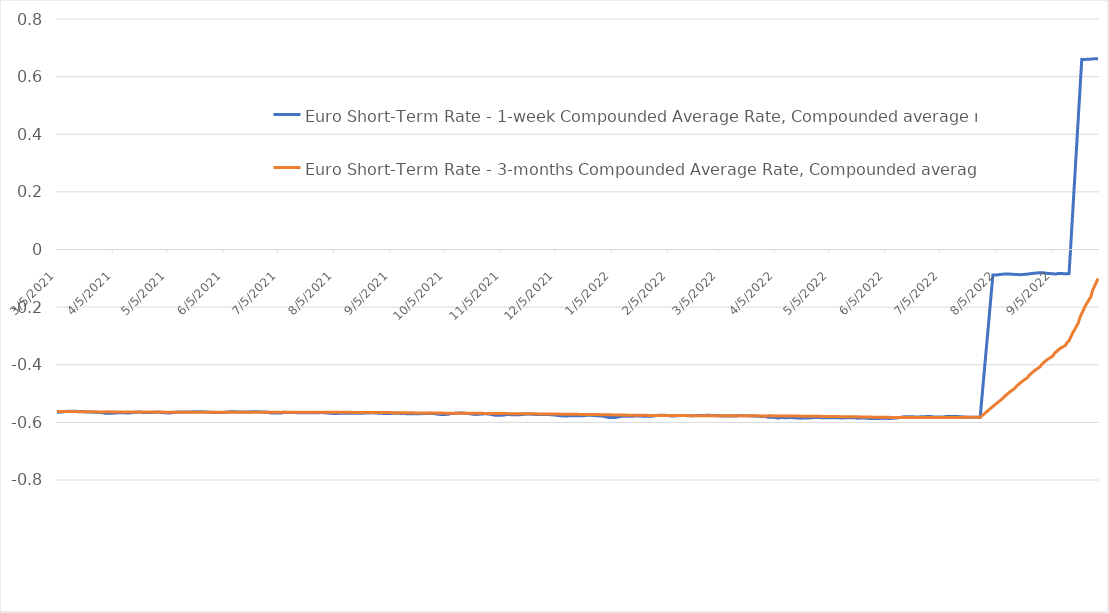
| Category | Euro Short-Term Rate - 1-week Compounded Average Rate, Compounded average rate | Euro Short-Term Rate - 3-months Compounded Average Rate, Compounded average rate |
|---|---|---|
| 9/30/22 | 0.662 | -0.101 |
| 9/29/22 | 0.662 | -0.114 |
| 9/28/22 | 0.662 | -0.128 |
| 9/27/22 | 0.661 | -0.141 |
| 9/26/22 | 0.661 | -0.164 |
| 9/23/22 | 0.66 | -0.195 |
| 9/22/22 | 0.66 | -0.209 |
| 9/21/22 | 0.66 | -0.222 |
| 9/20/22 | 0.554 | -0.236 |
| 9/19/22 | 0.448 | -0.256 |
| 9/16/22 | 0.128 | -0.29 |
| 9/15/22 | 0.022 | -0.303 |
| 9/14/22 | -0.084 | -0.317 |
| 9/13/22 | -0.084 | -0.322 |
| 9/12/22 | -0.084 | -0.333 |
| 9/9/22 | -0.083 | -0.344 |
| 9/8/22 | -0.083 | -0.349 |
| 9/7/22 | -0.085 | -0.354 |
| 9/6/22 | -0.085 | -0.36 |
| 9/5/22 | -0.084 | -0.37 |
| 9/2/22 | -0.083 | -0.382 |
| 9/1/22 | -0.082 | -0.387 |
| 8/31/22 | -0.081 | -0.393 |
| 8/30/22 | -0.08 | -0.398 |
| 8/29/22 | -0.081 | -0.407 |
| 8/26/22 | -0.082 | -0.42 |
| 8/25/22 | -0.083 | -0.426 |
| 8/24/22 | -0.084 | -0.431 |
| 8/23/22 | -0.085 | -0.436 |
| 8/22/22 | -0.085 | -0.445 |
| 8/19/22 | -0.087 | -0.458 |
| 8/18/22 | -0.087 | -0.464 |
| 8/17/22 | -0.087 | -0.469 |
| 8/16/22 | -0.087 | -0.475 |
| 8/15/22 | -0.086 | -0.482 |
| 8/12/22 | -0.085 | -0.496 |
| 8/11/22 | -0.085 | -0.501 |
| 8/10/22 | -0.085 | -0.507 |
| 8/9/22 | -0.085 | -0.512 |
| 8/8/22 | -0.086 | -0.519 |
| 8/5/22 | -0.088 | -0.534 |
| 8/4/22 | -0.089 | -0.539 |
| 8/3/22 | -0.089 | -0.545 |
| 8/2/22 | -0.159 | -0.55 |
| 8/1/22 | -0.23 | -0.555 |
| 7/29/22 | -0.44 | -0.572 |
| 7/28/22 | -0.511 | -0.577 |
| 7/27/22 | -0.582 | -0.582 |
| 7/26/22 | -0.583 | -0.582 |
| 7/25/22 | -0.582 | -0.583 |
| 7/22/22 | -0.582 | -0.583 |
| 7/21/22 | -0.582 | -0.583 |
| 7/20/22 | -0.582 | -0.583 |
| 7/19/22 | -0.582 | -0.583 |
| 7/18/22 | -0.581 | -0.583 |
| 7/15/22 | -0.58 | -0.583 |
| 7/14/22 | -0.58 | -0.583 |
| 7/13/22 | -0.579 | -0.583 |
| 7/12/22 | -0.579 | -0.583 |
| 7/11/22 | -0.579 | -0.583 |
| 7/8/22 | -0.58 | -0.583 |
| 7/7/22 | -0.582 | -0.583 |
| 7/6/22 | -0.581 | -0.583 |
| 7/5/22 | -0.581 | -0.583 |
| 7/4/22 | -0.581 | -0.583 |
| 7/1/22 | -0.581 | -0.583 |
| 6/30/22 | -0.579 | -0.583 |
| 6/29/22 | -0.58 | -0.583 |
| 6/28/22 | -0.58 | -0.583 |
| 6/27/22 | -0.58 | -0.583 |
| 6/24/22 | -0.581 | -0.583 |
| 6/23/22 | -0.581 | -0.583 |
| 6/22/22 | -0.582 | -0.583 |
| 6/21/22 | -0.581 | -0.583 |
| 6/20/22 | -0.581 | -0.583 |
| 6/17/22 | -0.58 | -0.583 |
| 6/16/22 | -0.58 | -0.583 |
| 6/15/22 | -0.581 | -0.583 |
| 6/14/22 | -0.581 | -0.583 |
| 6/13/22 | -0.583 | -0.583 |
| 6/10/22 | -0.585 | -0.583 |
| 6/9/22 | -0.586 | -0.583 |
| 6/8/22 | -0.586 | -0.583 |
| 6/7/22 | -0.587 | -0.583 |
| 6/6/22 | -0.586 | -0.582 |
| 6/3/22 | -0.585 | -0.582 |
| 6/2/22 | -0.586 | -0.582 |
| 6/1/22 | -0.587 | -0.582 |
| 5/31/22 | -0.586 | -0.582 |
| 5/30/22 | -0.586 | -0.582 |
| 5/27/22 | -0.586 | -0.582 |
| 5/26/22 | -0.586 | -0.582 |
| 5/25/22 | -0.585 | -0.581 |
| 5/24/22 | -0.585 | -0.581 |
| 5/23/22 | -0.585 | -0.581 |
| 5/20/22 | -0.585 | -0.581 |
| 5/19/22 | -0.584 | -0.581 |
| 5/18/22 | -0.584 | -0.581 |
| 5/17/22 | -0.584 | -0.581 |
| 5/16/22 | -0.584 | -0.581 |
| 5/13/22 | -0.584 | -0.58 |
| 5/12/22 | -0.585 | -0.58 |
| 5/11/22 | -0.585 | -0.58 |
| 5/10/22 | -0.584 | -0.58 |
| 5/9/22 | -0.584 | -0.58 |
| 5/6/22 | -0.584 | -0.58 |
| 5/5/22 | -0.584 | -0.58 |
| 5/4/22 | -0.584 | -0.58 |
| 5/3/22 | -0.584 | -0.579 |
| 5/2/22 | -0.584 | -0.579 |
| 4/29/22 | -0.583 | -0.579 |
| 4/28/22 | -0.583 | -0.579 |
| 4/27/22 | -0.583 | -0.579 |
| 4/26/22 | -0.583 | -0.579 |
| 4/25/22 | -0.584 | -0.579 |
| 4/22/22 | -0.585 | -0.579 |
| 4/21/22 | -0.585 | -0.578 |
| 4/20/22 | -0.585 | -0.578 |
| 4/19/22 | -0.585 | -0.578 |
| 4/14/22 | -0.583 | -0.578 |
| 4/13/22 | -0.583 | -0.578 |
| 4/12/22 | -0.584 | -0.578 |
| 4/11/22 | -0.584 | -0.578 |
| 4/8/22 | -0.583 | -0.578 |
| 4/7/22 | -0.585 | -0.578 |
| 4/6/22 | -0.584 | -0.578 |
| 4/5/22 | -0.583 | -0.577 |
| 4/4/22 | -0.582 | -0.577 |
| 4/1/22 | -0.582 | -0.577 |
| 3/31/22 | -0.58 | -0.578 |
| 3/30/22 | -0.58 | -0.578 |
| 3/29/22 | -0.58 | -0.578 |
| 3/28/22 | -0.579 | -0.577 |
| 3/25/22 | -0.578 | -0.577 |
| 3/24/22 | -0.578 | -0.577 |
| 3/23/22 | -0.578 | -0.577 |
| 3/22/22 | -0.577 | -0.577 |
| 3/21/22 | -0.577 | -0.577 |
| 3/18/22 | -0.577 | -0.577 |
| 3/17/22 | -0.576 | -0.577 |
| 3/16/22 | -0.577 | -0.577 |
| 3/15/22 | -0.578 | -0.577 |
| 3/14/22 | -0.578 | -0.577 |
| 3/11/22 | -0.578 | -0.577 |
| 3/10/22 | -0.578 | -0.577 |
| 3/9/22 | -0.578 | -0.577 |
| 3/8/22 | -0.578 | -0.577 |
| 3/7/22 | -0.578 | -0.577 |
| 3/4/22 | -0.577 | -0.577 |
| 3/3/22 | -0.577 | -0.577 |
| 3/2/22 | -0.576 | -0.577 |
| 3/1/22 | -0.576 | -0.577 |
| 2/28/22 | -0.575 | -0.577 |
| 2/25/22 | -0.576 | -0.577 |
| 2/24/22 | -0.576 | -0.577 |
| 2/23/22 | -0.576 | -0.577 |
| 2/22/22 | -0.576 | -0.577 |
| 2/21/22 | -0.576 | -0.577 |
| 2/18/22 | -0.577 | -0.577 |
| 2/17/22 | -0.577 | -0.577 |
| 2/16/22 | -0.577 | -0.577 |
| 2/15/22 | -0.577 | -0.576 |
| 2/14/22 | -0.577 | -0.576 |
| 2/11/22 | -0.577 | -0.576 |
| 2/10/22 | -0.577 | -0.576 |
| 2/9/22 | -0.577 | -0.576 |
| 2/8/22 | -0.578 | -0.576 |
| 2/7/22 | -0.578 | -0.576 |
| 2/4/22 | -0.576 | -0.576 |
| 2/3/22 | -0.575 | -0.576 |
| 2/2/22 | -0.575 | -0.576 |
| 2/1/22 | -0.575 | -0.576 |
| 1/31/22 | -0.575 | -0.576 |
| 1/28/22 | -0.578 | -0.576 |
| 1/27/22 | -0.578 | -0.576 |
| 1/26/22 | -0.579 | -0.576 |
| 1/25/22 | -0.579 | -0.576 |
| 1/24/22 | -0.579 | -0.576 |
| 1/21/22 | -0.578 | -0.575 |
| 1/20/22 | -0.578 | -0.575 |
| 1/19/22 | -0.578 | -0.575 |
| 1/18/22 | -0.578 | -0.575 |
| 1/17/22 | -0.578 | -0.575 |
| 1/14/22 | -0.579 | -0.575 |
| 1/13/22 | -0.579 | -0.575 |
| 1/12/22 | -0.579 | -0.575 |
| 1/11/22 | -0.579 | -0.575 |
| 1/10/22 | -0.579 | -0.574 |
| 1/7/22 | -0.583 | -0.574 |
| 1/6/22 | -0.583 | -0.574 |
| 1/5/22 | -0.583 | -0.574 |
| 1/4/22 | -0.583 | -0.574 |
| 1/3/22 | -0.583 | -0.574 |
| 12/31/21 | -0.578 | -0.573 |
| 12/30/21 | -0.578 | -0.573 |
| 12/29/21 | -0.577 | -0.573 |
| 12/28/21 | -0.577 | -0.573 |
| 12/27/21 | -0.577 | -0.573 |
| 12/24/21 | -0.575 | -0.573 |
| 12/23/21 | -0.575 | -0.573 |
| 12/22/21 | -0.576 | -0.572 |
| 12/21/21 | -0.576 | -0.572 |
| 12/20/21 | -0.577 | -0.572 |
| 12/17/21 | -0.577 | -0.572 |
| 12/16/21 | -0.577 | -0.572 |
| 12/15/21 | -0.577 | -0.572 |
| 12/14/21 | -0.577 | -0.572 |
| 12/13/21 | -0.577 | -0.572 |
| 12/10/21 | -0.578 | -0.572 |
| 12/9/21 | -0.577 | -0.572 |
| 12/8/21 | -0.577 | -0.571 |
| 12/7/21 | -0.577 | -0.571 |
| 12/6/21 | -0.576 | -0.571 |
| 12/3/21 | -0.574 | -0.571 |
| 12/2/21 | -0.573 | -0.571 |
| 12/1/21 | -0.573 | -0.571 |
| 11/30/21 | -0.573 | -0.571 |
| 11/29/21 | -0.573 | -0.571 |
| 11/26/21 | -0.573 | -0.571 |
| 11/25/21 | -0.572 | -0.57 |
| 11/24/21 | -0.573 | -0.57 |
| 11/23/21 | -0.572 | -0.57 |
| 11/22/21 | -0.572 | -0.57 |
| 11/19/21 | -0.571 | -0.57 |
| 11/18/21 | -0.572 | -0.57 |
| 11/17/21 | -0.572 | -0.57 |
| 11/16/21 | -0.573 | -0.57 |
| 11/15/21 | -0.574 | -0.57 |
| 11/12/21 | -0.574 | -0.57 |
| 11/11/21 | -0.574 | -0.57 |
| 11/10/21 | -0.573 | -0.57 |
| 11/9/21 | -0.572 | -0.57 |
| 11/8/21 | -0.573 | -0.57 |
| 11/5/21 | -0.576 | -0.569 |
| 11/4/21 | -0.576 | -0.569 |
| 11/3/21 | -0.575 | -0.569 |
| 11/2/21 | -0.576 | -0.569 |
| 11/1/21 | -0.574 | -0.569 |
| 10/29/21 | -0.571 | -0.569 |
| 10/28/21 | -0.571 | -0.569 |
| 10/27/21 | -0.57 | -0.569 |
| 10/26/21 | -0.571 | -0.569 |
| 10/25/21 | -0.571 | -0.569 |
| 10/22/21 | -0.572 | -0.569 |
| 10/21/21 | -0.572 | -0.569 |
| 10/20/21 | -0.572 | -0.569 |
| 10/19/21 | -0.57 | -0.568 |
| 10/18/21 | -0.57 | -0.568 |
| 10/15/21 | -0.568 | -0.568 |
| 10/14/21 | -0.568 | -0.568 |
| 10/13/21 | -0.568 | -0.568 |
| 10/12/21 | -0.569 | -0.568 |
| 10/11/21 | -0.568 | -0.568 |
| 10/8/21 | -0.57 | -0.568 |
| 10/7/21 | -0.571 | -0.568 |
| 10/6/21 | -0.572 | -0.568 |
| 10/5/21 | -0.572 | -0.568 |
| 10/4/21 | -0.573 | -0.568 |
| 10/1/21 | -0.572 | -0.568 |
| 9/30/21 | -0.57 | -0.568 |
| 9/29/21 | -0.57 | -0.568 |
| 9/28/21 | -0.569 | -0.568 |
| 9/27/21 | -0.569 | -0.568 |
| 9/24/21 | -0.569 | -0.567 |
| 9/23/21 | -0.569 | -0.567 |
| 9/22/21 | -0.57 | -0.567 |
| 9/21/21 | -0.57 | -0.567 |
| 9/20/21 | -0.57 | -0.567 |
| 9/17/21 | -0.57 | -0.567 |
| 9/16/21 | -0.57 | -0.567 |
| 9/15/21 | -0.57 | -0.567 |
| 9/14/21 | -0.57 | -0.567 |
| 9/13/21 | -0.57 | -0.567 |
| 9/10/21 | -0.569 | -0.567 |
| 9/9/21 | -0.569 | -0.566 |
| 9/8/21 | -0.569 | -0.566 |
| 9/7/21 | -0.569 | -0.566 |
| 9/6/21 | -0.569 | -0.566 |
| 9/3/21 | -0.569 | -0.566 |
| 9/2/21 | -0.57 | -0.566 |
| 9/1/21 | -0.569 | -0.566 |
| 8/31/21 | -0.568 | -0.566 |
| 8/30/21 | -0.568 | -0.566 |
| 8/27/21 | -0.567 | -0.566 |
| 8/26/21 | -0.567 | -0.566 |
| 8/25/21 | -0.567 | -0.566 |
| 8/24/21 | -0.567 | -0.566 |
| 8/23/21 | -0.567 | -0.566 |
| 8/20/21 | -0.568 | -0.566 |
| 8/19/21 | -0.568 | -0.566 |
| 8/18/21 | -0.568 | -0.565 |
| 8/17/21 | -0.568 | -0.565 |
| 8/16/21 | -0.568 | -0.565 |
| 8/13/21 | -0.568 | -0.565 |
| 8/12/21 | -0.568 | -0.565 |
| 8/11/21 | -0.568 | -0.565 |
| 8/10/21 | -0.569 | -0.565 |
| 8/9/21 | -0.568 | -0.565 |
| 8/6/21 | -0.569 | -0.565 |
| 8/5/21 | -0.569 | -0.565 |
| 8/4/21 | -0.569 | -0.565 |
| 8/3/21 | -0.568 | -0.565 |
| 8/2/21 | -0.568 | -0.565 |
| 7/30/21 | -0.566 | -0.565 |
| 7/29/21 | -0.566 | -0.565 |
| 7/28/21 | -0.566 | -0.565 |
| 7/27/21 | -0.567 | -0.565 |
| 7/26/21 | -0.566 | -0.565 |
| 7/23/21 | -0.566 | -0.565 |
| 7/22/21 | -0.567 | -0.565 |
| 7/21/21 | -0.567 | -0.565 |
| 7/20/21 | -0.566 | -0.565 |
| 7/19/21 | -0.567 | -0.565 |
| 7/16/21 | -0.566 | -0.565 |
| 7/15/21 | -0.566 | -0.565 |
| 7/14/21 | -0.566 | -0.565 |
| 7/13/21 | -0.566 | -0.564 |
| 7/12/21 | -0.566 | -0.564 |
| 7/9/21 | -0.565 | -0.565 |
| 7/8/21 | -0.565 | -0.565 |
| 7/7/21 | -0.567 | -0.565 |
| 7/6/21 | -0.568 | -0.565 |
| 7/5/21 | -0.568 | -0.565 |
| 7/2/21 | -0.568 | -0.565 |
| 7/1/21 | -0.568 | -0.565 |
| 6/30/21 | -0.565 | -0.565 |
| 6/29/21 | -0.565 | -0.565 |
| 6/28/21 | -0.564 | -0.565 |
| 6/25/21 | -0.564 | -0.565 |
| 6/24/21 | -0.563 | -0.565 |
| 6/23/21 | -0.563 | -0.565 |
| 6/22/21 | -0.563 | -0.565 |
| 6/21/21 | -0.563 | -0.565 |
| 6/18/21 | -0.564 | -0.565 |
| 6/17/21 | -0.564 | -0.565 |
| 6/16/21 | -0.564 | -0.565 |
| 6/15/21 | -0.564 | -0.565 |
| 6/14/21 | -0.564 | -0.565 |
| 6/11/21 | -0.563 | -0.565 |
| 6/10/21 | -0.563 | -0.565 |
| 6/9/21 | -0.563 | -0.565 |
| 6/8/21 | -0.563 | -0.565 |
| 6/7/21 | -0.564 | -0.565 |
| 6/4/21 | -0.566 | -0.565 |
| 6/3/21 | -0.566 | -0.565 |
| 6/2/21 | -0.566 | -0.565 |
| 6/1/21 | -0.566 | -0.565 |
| 5/31/21 | -0.565 | -0.565 |
| 5/28/21 | -0.565 | -0.565 |
| 5/27/21 | -0.564 | -0.565 |
| 5/26/21 | -0.564 | -0.565 |
| 5/25/21 | -0.563 | -0.565 |
| 5/24/21 | -0.563 | -0.565 |
| 5/21/21 | -0.563 | -0.564 |
| 5/20/21 | -0.563 | -0.565 |
| 5/19/21 | -0.563 | -0.565 |
| 5/18/21 | -0.564 | -0.565 |
| 5/17/21 | -0.564 | -0.565 |
| 5/14/21 | -0.564 | -0.565 |
| 5/13/21 | -0.564 | -0.565 |
| 5/12/21 | -0.564 | -0.565 |
| 5/11/21 | -0.564 | -0.565 |
| 5/10/21 | -0.564 | -0.565 |
| 5/7/21 | -0.567 | -0.565 |
| 5/6/21 | -0.567 | -0.565 |
| 5/5/21 | -0.567 | -0.565 |
| 5/4/21 | -0.567 | -0.565 |
| 5/3/21 | -0.567 | -0.564 |
| 4/30/21 | -0.565 | -0.564 |
| 4/29/21 | -0.565 | -0.564 |
| 4/28/21 | -0.565 | -0.564 |
| 4/27/21 | -0.566 | -0.564 |
| 4/26/21 | -0.566 | -0.564 |
| 4/23/21 | -0.566 | -0.564 |
| 4/22/21 | -0.566 | -0.564 |
| 4/21/21 | -0.565 | -0.564 |
| 4/20/21 | -0.564 | -0.564 |
| 4/19/21 | -0.564 | -0.564 |
| 4/16/21 | -0.566 | -0.564 |
| 4/15/21 | -0.566 | -0.564 |
| 4/14/21 | -0.567 | -0.564 |
| 4/13/21 | -0.568 | -0.564 |
| 4/12/21 | -0.567 | -0.564 |
| 4/9/21 | -0.567 | -0.564 |
| 4/8/21 | -0.566 | -0.564 |
| 4/7/21 | -0.567 | -0.564 |
| 4/6/21 | -0.568 | -0.564 |
| 4/1/21 | -0.569 | -0.564 |
| 3/31/21 | -0.567 | -0.564 |
| 3/30/21 | -0.566 | -0.564 |
| 3/29/21 | -0.566 | -0.564 |
| 3/26/21 | -0.565 | -0.563 |
| 3/25/21 | -0.565 | -0.563 |
| 3/24/21 | -0.564 | -0.563 |
| 3/23/21 | -0.564 | -0.563 |
| 3/22/21 | -0.564 | -0.563 |
| 3/19/21 | -0.563 | -0.563 |
| 3/18/21 | -0.562 | -0.563 |
| 3/17/21 | -0.562 | -0.563 |
| 3/16/21 | -0.562 | -0.563 |
| 3/15/21 | -0.561 | -0.563 |
| 3/12/21 | -0.561 | -0.562 |
| 3/11/21 | -0.562 | -0.562 |
| 3/10/21 | -0.562 | -0.562 |
| 3/9/21 | -0.563 | -0.562 |
| 3/8/21 | -0.563 | -0.562 |
| 3/5/21 | -0.565 | -0.562 |